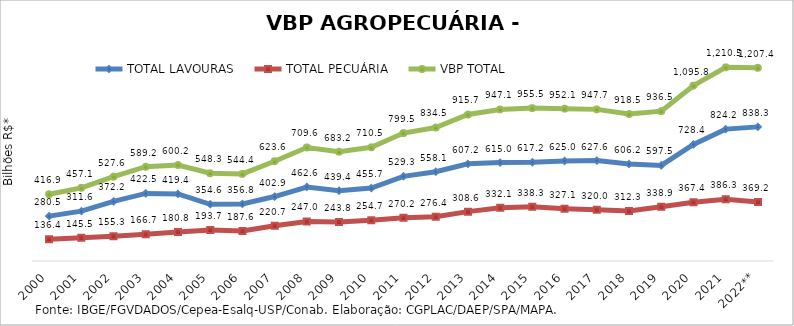
| Category | TOTAL LAVOURAS | TOTAL PECUÁRIA | VBP TOTAL |
|---|---|---|---|
| 2000 | 280.538 | 136.366 | 416.904 |
| 2001 | 311.625 | 145.486 | 457.111 |
| 2002 | 372.247 | 155.307 | 527.554 |
| 2003 | 422.498 | 166.695 | 589.193 |
| 2004 | 419.404 | 180.816 | 600.221 |
| 2005 | 354.588 | 193.698 | 548.286 |
| 2006 | 356.754 | 187.599 | 544.353 |
| 2007 | 402.888 | 220.7 | 623.588 |
| 2008 | 462.615 | 247.016 | 709.631 |
| 2009 | 439.423 | 243.803 | 683.226 |
| 2010 | 455.731 | 254.727 | 710.457 |
| 2011 | 529.275 | 270.2 | 799.475 |
| 2012 | 558.056 | 276.398 | 834.454 |
| 2013 | 607.169 | 308.565 | 915.734 |
| 2014 | 614.98 | 332.104 | 947.085 |
| 2015 | 617.212 | 338.324 | 955.535 |
| 2016 | 625.016 | 327.074 | 952.091 |
| 2017 | 627.611 | 320.046 | 947.658 |
| 2018 | 606.237 | 312.306 | 918.544 |
| 2019 | 597.519 | 338.942 | 936.461 |
| 2020 | 728.39 | 367.391 | 1095.781 |
| 2021 | 824.191 | 386.268 | 1210.459 |
| 2022** | 838.257 | 369.151 | 1207.408 |